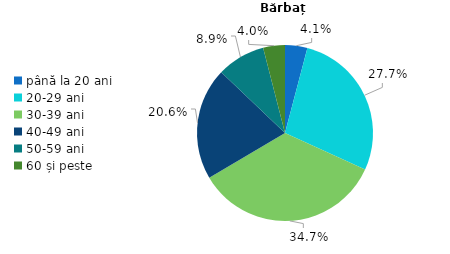
| Category | Series 0 |
|---|---|
| până la 20 ani | 4.1 |
| 20-29 ani | 27.7 |
| 30-39 ani | 34.7 |
| 40-49 ani | 20.6 |
| 50-59 ani | 8.9 |
| 60 și peste | 4 |